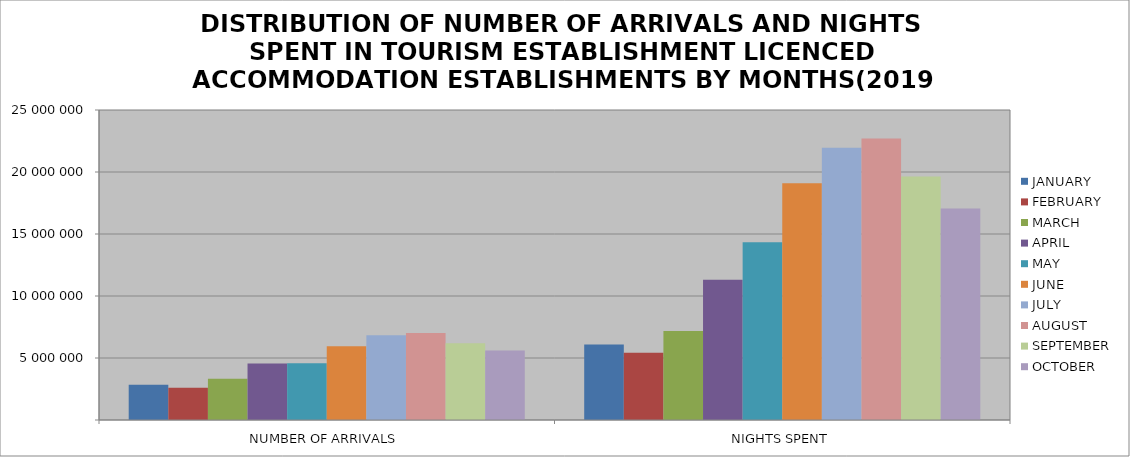
| Category | JANUARY | FEBRUARY | MARCH | APRIL | MAY | JUNE | JULY | AUGUST | SEPTEMBER | OCTOBER |
|---|---|---|---|---|---|---|---|---|---|---|
| NUMBER OF ARRIVALS | 2833509 | 2607189 | 3326719 | 4561709 | 4585981 | 5949977 | 6830740 | 7020795 | 6189605 | 5614434 |
| NIGHTS SPENT | 6098050 | 5425989 | 7182593 | 11302946 | 14338328 | 19092571 | 21955256 | 22706728 | 19635859 | 17054807 |